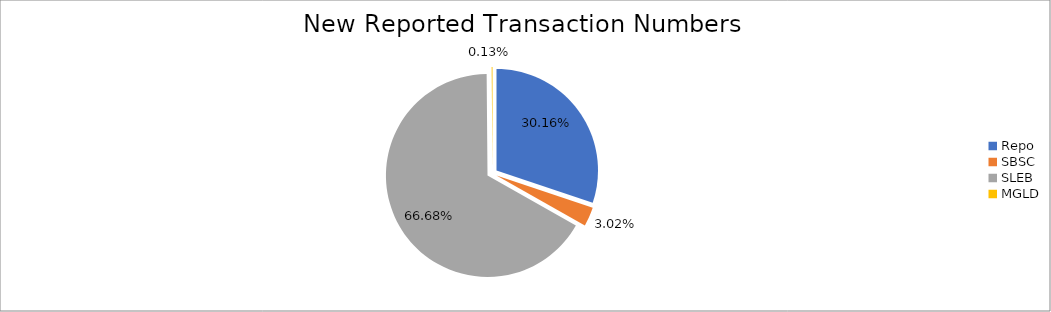
| Category | Series 0 |
|---|---|
| Repo | 436385 |
| SBSC | 43738 |
| SLEB | 964750 |
| MGLD | 1941 |